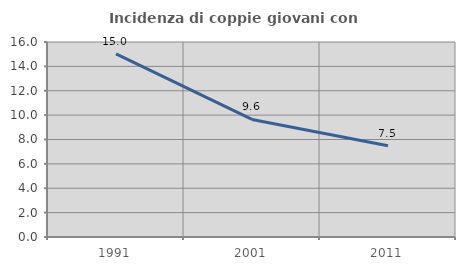
| Category | Incidenza di coppie giovani con figli |
|---|---|
| 1991.0 | 15.022 |
| 2001.0 | 9.646 |
| 2011.0 | 7.482 |